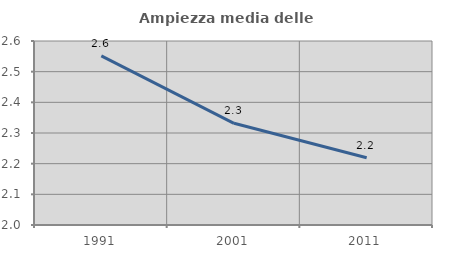
| Category | Ampiezza media delle famiglie |
|---|---|
| 1991.0 | 2.552 |
| 2001.0 | 2.332 |
| 2011.0 | 2.219 |